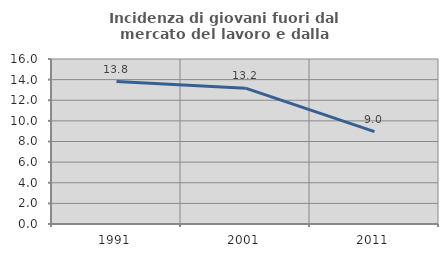
| Category | Incidenza di giovani fuori dal mercato del lavoro e dalla formazione  |
|---|---|
| 1991.0 | 13.807 |
| 2001.0 | 13.171 |
| 2011.0 | 8.958 |